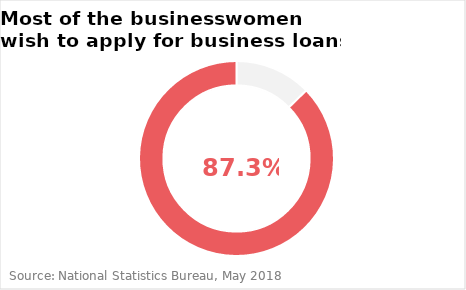
| Category | % |
|---|---|
| No, I don't want loan | 12.7 |
| Yes, I want loan   | 87.3 |